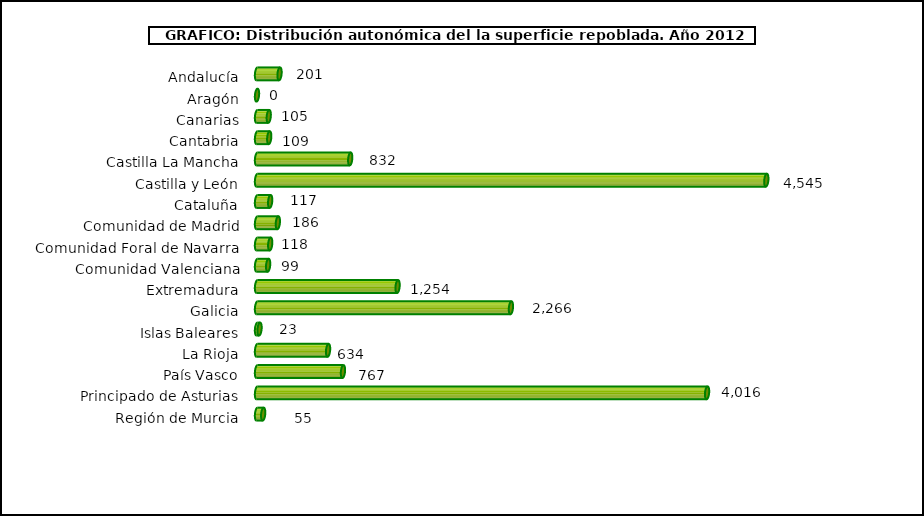
| Category | repoblacion |
|---|---|
| Andalucía | 201 |
| Aragón | 0 |
| Canarias | 104.8 |
| Cantabria | 109.05 |
| Castilla La Mancha | 831.75 |
| Castilla y León | 4545.02 |
| Cataluña | 117.38 |
| Comunidad de Madrid | 186.004 |
| Comunidad Foral de Navarra | 117.73 |
| Comunidad Valenciana | 99.28 |
| Extremadura | 1254.47 |
| Galicia | 2266 |
| Islas Baleares | 22.81 |
| La Rioja | 634.138 |
| País Vasco | 767.09 |
| Principado de Asturias | 4016.18 |
| Región de Murcia | 55.07 |